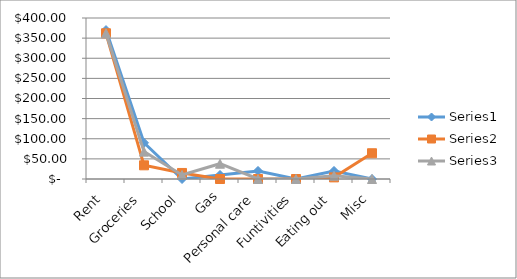
| Category | Series 0 | Series 1 | Series 2 |
|---|---|---|---|
| Rent | 370 | 362 | 362 |
| Groceries | 90 | 34 | 68 |
| School | 0 | 15 | 10 |
| Gas | 10 | 0 | 38 |
| Personal care | 20 | 0 | 0 |
| Funtivities | 0 | 0 | 0 |
| Eating out | 20 | 4 | 8 |
| Misc | 0 | 64 | 0 |